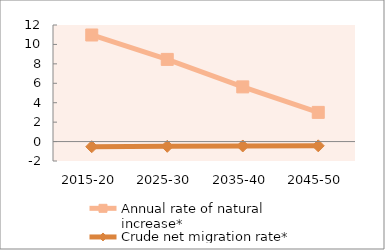
| Category | Annual rate of natural increase* | Crude net migration rate* |
|---|---|---|
| 2015-20 | 10.972 | -0.533 |
| 2025-30 | 8.459 | -0.487 |
| 2035-40 | 5.629 | -0.455 |
| 2045-50 | 3.004 | -0.438 |